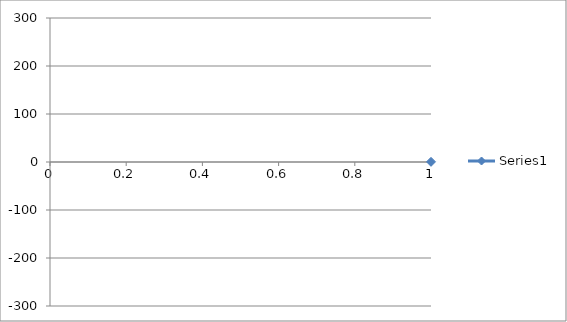
| Category | Series 0 |
|---|---|
| 0 | 0.35 |
| 1 | 0.403 |
| 2 | 0.447 |
| 3 | 0.451 |
| 4 | 0.485 |
| 5 | 0.522 |
| 6 | 0.569 |
| 7 | 0.64 |
| 8 | 0.696 |
| 9 | 0.769 |
| 10 | 0.833 |
| 11 | 0.905 |
| 12 | 0.991 |
| 13 | 1.096 |
| 14 | 1.228 |
| 15 | 1.358 |
| 16 | 1.511 |
| 17 | 1.701 |
| 18 | 1.898 |
| 19 | 2.17 |
| 20 | 2.462 |
| 21 | 2.839 |
| 22 | 3.288 |
| 23 | 3.853 |
| 24 | 4.526 |
| 25 | 5.363 |
| 26 | 6.886 |
| 27 | 8.295 |
| 28 | 9.945 |
| 29 | 12.547 |
| 30 | 15.419 |
| 31 | 16.96 |
| 32 | 18.649 |
| 33 | 20.336 |
| 34 | 22.905 |
| 35 | 25.407 |
| 36 | 27.949 |
| 37 | 30.803 |
| 38 | 33.877 |
| 39 | 37.723 |
| 40 | 41.829 |
| 41 | 46.41 |
| 42 | 51.168 |
| 43 | 57 |
| 44 | 63.665 |
| 45 | 70.546 |
| 46 | 78.157 |
| 47 | 86.473 |
| 48 | 95.11 |
| 49 | 104.898 |
| 50 | 114.383 |
| 51 | 125.043 |
| 52 | 136.226 |
| 53 | 146.931 |
| 54 | 157.817 |
| 55 | 168.838 |
| 56 | 179.43 |
| 57 | 189.302 |
| 58 | 198.718 |
| 59 | 207.332 |
| 60 | 214.677 |
| 61 | 220.44 |
| 62 | 225.221 |
| 63 | 228.045 |
| 64 | 229.354 |
| 65 | 229.175 |
| 66 | 227.282 |
| 67 | 222.993 |
| 68 | 216.796 |
| 69 | 208.711 |
| 70 | 198.545 |
| 71 | 186.593 |
| 72 | 172.197 |
| 73 | 155.988 |
| 74 | 137.952 |
| 75 | 118.377 |
| 76 | 97.008 |
| 77 | 74.681 |
| 78 | 51.606 |
| 79 | 27.174 |
| 80 | 2.496 |
| 81 | -21.884 |
| 82 | -46.13 |
| 83 | -69.99 |
| 84 | -93.184 |
| 85 | -114.48 |
| 86 | -134.217 |
| 87 | -152.703 |
| 88 | -169.099 |
| 89 | -183.292 |
| 90 | -195.731 |
| 91 | -206.046 |
| 92 | -214.447 |
| 93 | -221.122 |
| 94 | -225.551 |
| 95 | -228.268 |
| 96 | -228.687 |
| 97 | -228.407 |
| 98 | -225.681 |
| 99 | -221.36 |
| 100 | -215.485 |
| 101 | -208.693 |
| 102 | -200.598 |
| 103 | -191.111 |
| 104 | -181.325 |
| 105 | -170.885 |
| 106 | -160.15 |
| 107 | -148.844 |
| 108 | -137.765 |
| 109 | -127.028 |
| 110 | -116.263 |
| 111 | -106.054 |
| 112 | -96.593 |
| 113 | -87.862 |
| 114 | -79.497 |
| 115 | -71.89 |
| 116 | -64.833 |
| 117 | -58.349 |
| 118 | -52.681 |
| 119 | -47.279 |
| 120 | -42.807 |
| 121 | -38.41 |
| 122 | -34.64 |
| 123 | -31.592 |
| 124 | -28.64 |
| 125 | -25.955 |
| 126 | -23.238 |
| 127 | -21.501 |
| 128 | -19.491 |
| 129 | -17.846 |
| 130 | -16.22 |
| 131 | -13.17 |
| 132 | -10.303 |
| 133 | -8.611 |
| 134 | -7.015 |
| 135 | -5.699 |
| 136 | -5.116 |
| 137 | -4.413 |
| 138 | -3.728 |
| 139 | -3.15 |
| 140 | -2.562 |
| 141 | -2.192 |
| 142 | -1.947 |
| 143 | -1.659 |
| 144 | -1.441 |
| 145 | -1.237 |
| 146 | -1.061 |
| 147 | -0.911 |
| 148 | -0.76 |
| 149 | -0.647 |
| 150 | -0.574 |
| 151 | -0.501 |
| 152 | -0.419 |
| 153 | -0.352 |
| 154 | -0.298 |
| 155 | -0.242 |
| 156 | -0.214 |
| 157 | -0.169 |
| 158 | -0.122 |
| 159 | -0.067 |
| 160 | -0.059 |